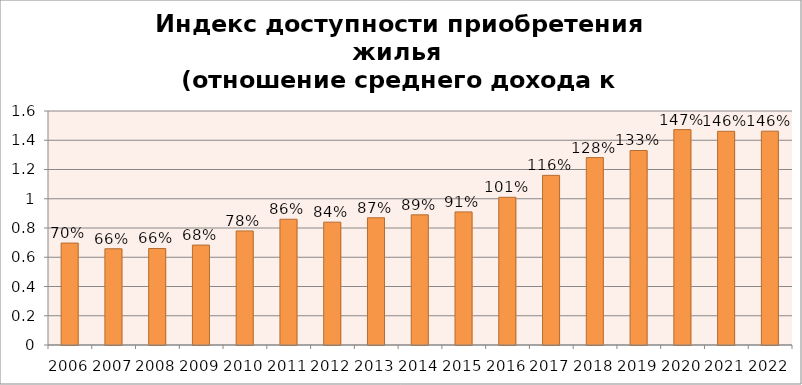
| Category | Series 0 |
|---|---|
| 2006.0 | 0.697 |
| 2007.0 | 0.658 |
| 2008.0 | 0.66 |
| 2009.0 | 0.683 |
| 2010.0 | 0.78 |
| 2011.0 | 0.86 |
| 2012.0 | 0.84 |
| 2013.0 | 0.87 |
| 2014.0 | 0.89 |
| 2015.0 | 0.91 |
| 2016.0 | 1.01 |
| 2017.0 | 1.16 |
| 2018.0 | 1.281 |
| 2019.0 | 1.33 |
| 2020.0 | 1.473 |
| 2021.0 | 1.461 |
| 2022.0 | 1.462 |